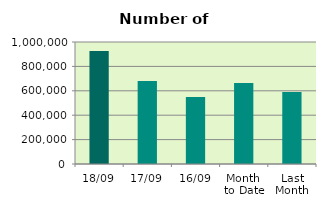
| Category | Series 0 |
|---|---|
| 18/09 | 926644 |
| 17/09 | 679866 |
| 16/09 | 548216 |
| Month 
to Date | 663297 |
| Last
Month | 590023.333 |